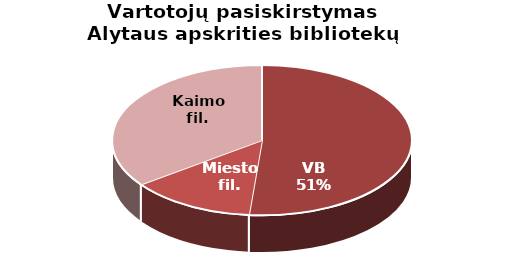
| Category | Vartotojų pasiskirstymas Alytaus apskrities bibliotekų padaliniuose |
|---|---|
| VB | 21013 |
| Miesto fil. | 5545 |
| Kaimo fil. | 14333 |